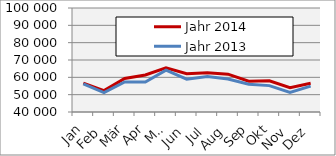
| Category | Jahr 2014 | Jahr 2013 |
|---|---|---|
| Jan | 56704.936 | 56273.451 |
| Feb | 52318.284 | 51174.098 |
| Mär | 59330.981 | 57330.222 |
| Apr | 61326.886 | 57288.32 |
| Mai | 65426.133 | 64095.735 |
| Jun | 62048.127 | 58894.753 |
| Jul | 62659.687 | 60425.724 |
| Aug | 61844.508 | 59027.166 |
| Sep | 57752.091 | 56018.033 |
| Okt | 58009.35 | 55221.98 |
| Nov | 54040.818 | 51308.179 |
| Dez | 56593.102 | 54942.205 |